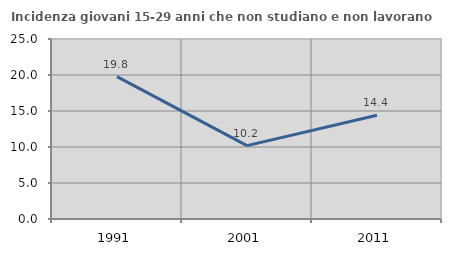
| Category | Incidenza giovani 15-29 anni che non studiano e non lavorano  |
|---|---|
| 1991.0 | 19.784 |
| 2001.0 | 10.189 |
| 2011.0 | 14.414 |